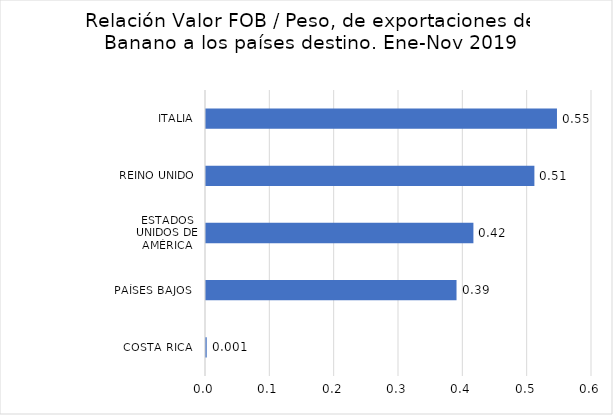
| Category | Series 0 |
|---|---|
| COSTA RICA   | 0.001 |
| PAÍSES BAJOS   | 0.389 |
| ESTADOS UNIDOS DE AMÉRICA | 0.416 |
| REINO UNIDO  | 0.51 |
| ITALIA  | 0.546 |